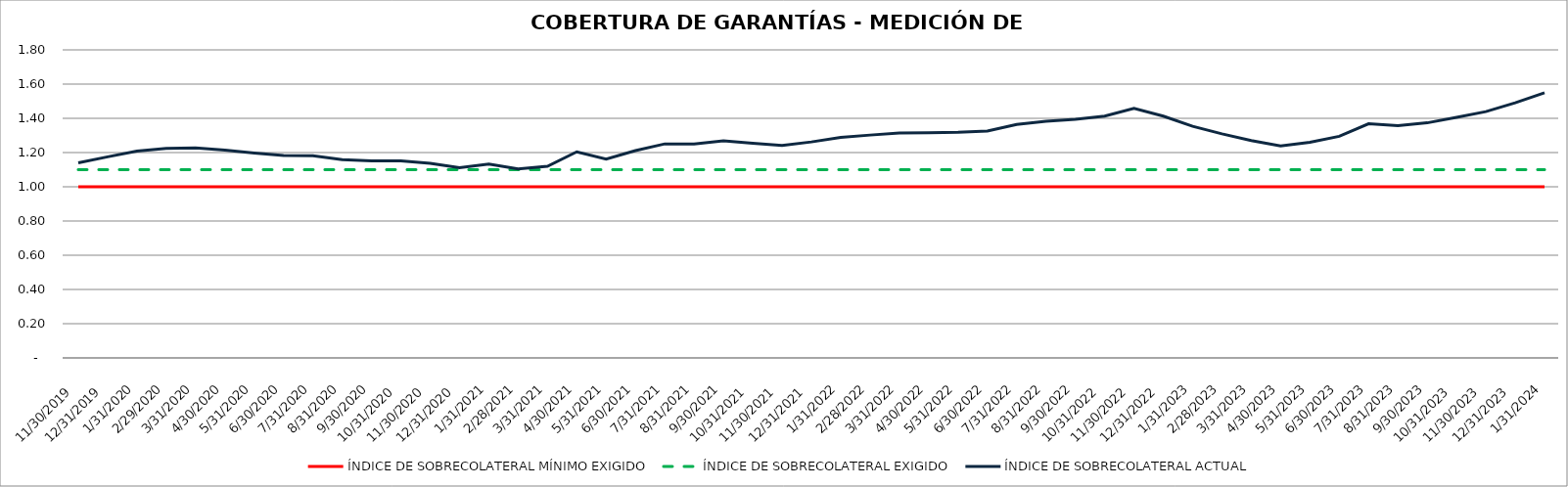
| Category | ÍNDICE DE SOBRECOLATERAL MÍNIMO EXIGIDO | ÍNDICE DE SOBRECOLATERAL EXIGIDO | ÍNDICE DE SOBRECOLATERAL ACTUAL |
|---|---|---|---|
| 11/30/19 | 1 | 1.1 | 1.14 |
| 12/31/19 | 1 | 1.1 | 1.175 |
| 1/31/20 | 1 | 1.1 | 1.209 |
| 2/29/20 | 1 | 1.1 | 1.225 |
| 3/31/20 | 1 | 1.1 | 1.228 |
| 4/30/20 | 1 | 1.1 | 1.214 |
| 5/31/20 | 1 | 1.1 | 1.197 |
| 6/30/20 | 1 | 1.1 | 1.182 |
| 7/31/20 | 1 | 1.1 | 1.182 |
| 8/31/20 | 1 | 1.1 | 1.159 |
| 9/30/20 | 1 | 1.1 | 1.151 |
| 10/31/20 | 1 | 1.1 | 1.151 |
| 11/30/20 | 1 | 1.1 | 1.137 |
| 12/31/20 | 1 | 1.1 | 1.111 |
| 1/31/21 | 1 | 1.1 | 1.133 |
| 2/28/21 | 1 | 1.1 | 1.105 |
| 3/31/21 | 1 | 1.1 | 1.12 |
| 4/30/21 | 1 | 1.1 | 1.204 |
| 5/31/21 | 1 | 1.1 | 1.162 |
| 6/30/21 | 1 | 1.1 | 1.211 |
| 7/31/21 | 1 | 1.1 | 1.251 |
| 8/31/21 | 1 | 1.1 | 1.25 |
| 9/30/21 | 1 | 1.1 | 1.269 |
| 10/31/21 | 1 | 1.1 | 1.255 |
| 11/30/21 | 1 | 1.1 | 1.241 |
| 12/31/21 | 1 | 1.1 | 1.262 |
| 1/31/22 | 1 | 1.1 | 1.289 |
| 2/28/22 | 1 | 1.1 | 1.302 |
| 3/31/22 | 1 | 1.1 | 1.314 |
| 4/30/22 | 1 | 1.1 | 1.316 |
| 5/31/22 | 1 | 1.1 | 1.318 |
| 6/30/22 | 1 | 1.1 | 1.326 |
| 7/31/22 | 1 | 1.1 | 1.364 |
| 8/31/22 | 1 | 1.1 | 1.383 |
| 9/30/22 | 1 | 1.1 | 1.394 |
| 10/31/22 | 1 | 1.1 | 1.413 |
| 11/30/22 | 1 | 1.1 | 1.458 |
| 12/31/22 | 1 | 1.1 | 1.413 |
| 1/31/23 | 1 | 1.1 | 1.354 |
| 2/28/23 | 1 | 1.1 | 1.309 |
| 3/31/23 | 1 | 1.1 | 1.27 |
| 4/30/23 | 1 | 1.1 | 1.239 |
| 5/31/23 | 1 | 1.1 | 1.26 |
| 6/30/23 | 1 | 1.1 | 1.295 |
| 7/31/23 | 1 | 1.1 | 1.368 |
| 8/31/23 | 1 | 1.1 | 1.357 |
| 9/30/23 | 1 | 1.1 | 1.374 |
| 10/31/23 | 1 | 1.1 | 1.406 |
| 11/30/23 | 1 | 1.1 | 1.439 |
| 12/31/23 | 1 | 1.1 | 1.491 |
| 1/31/24 | 1 | 1.1 | 1.55 |